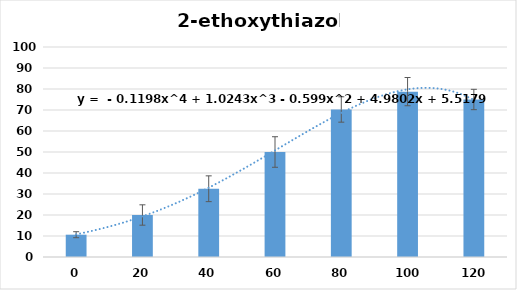
| Category | Series 0 |
|---|---|
| 0.0 | 10.625 |
| 20.0 | 20 |
| 40.0 | 32.5 |
| 60.0 | 50 |
| 80.0 | 70.25 |
| 100.0 | 78.75 |
| 120.0 | 75 |